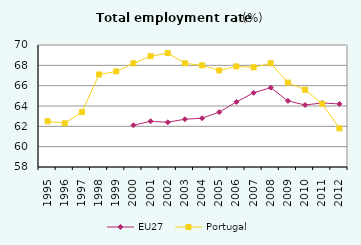
| Category | EU27 | Portugal |
|---|---|---|
| 1995.0 | 0 | 62.5 |
| 1996.0 | 0 | 62.3 |
| 1997.0 | 0 | 63.4 |
| 1998.0 | 0 | 67.1 |
| 1999.0 | 0 | 67.4 |
| 2000.0 | 62.1 | 68.2 |
| 2001.0 | 62.5 | 68.9 |
| 2002.0 | 62.4 | 69.2 |
| 2003.0 | 62.7 | 68.2 |
| 2004.0 | 62.8 | 68 |
| 2005.0 | 63.4 | 67.5 |
| 2006.0 | 64.4 | 67.9 |
| 2007.0 | 65.3 | 67.8 |
| 2008.0 | 65.8 | 68.2 |
| 2009.0 | 64.5 | 66.3 |
| 2010.0 | 64.1 | 65.6 |
| 2011.0 | 64.3 | 64.2 |
| 2012.0 | 64.2 | 61.8 |